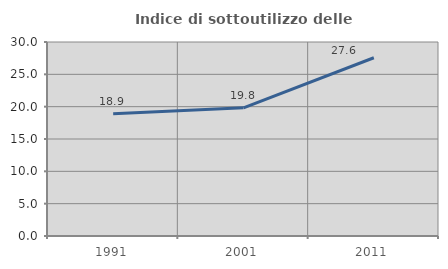
| Category | Indice di sottoutilizzo delle abitazioni  |
|---|---|
| 1991.0 | 18.905 |
| 2001.0 | 19.824 |
| 2011.0 | 27.562 |